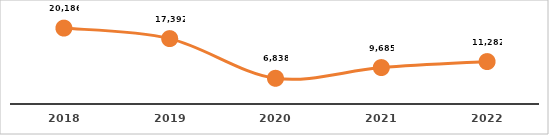
| Category | SERVICIOS TECNOLÓGICOS (%) |
|---|---|
| 2018.0 | 20186 |
| 2019.0 | 17392 |
| 2020.0 | 6838 |
| 2021.0 | 9685 |
| 2022.0 | 11282 |